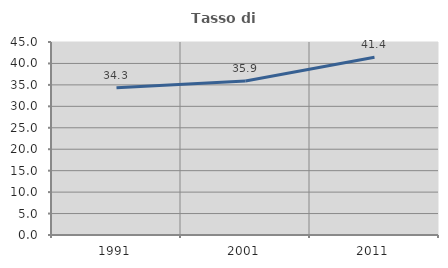
| Category | Tasso di occupazione   |
|---|---|
| 1991.0 | 34.308 |
| 2001.0 | 35.891 |
| 2011.0 | 41.444 |